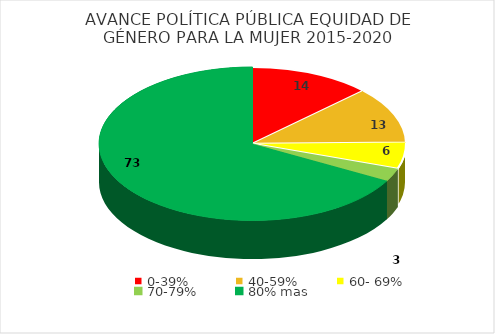
| Category | CANTIDAD |
|---|---|
| 0-39% | 14 |
| 40-59% | 13 |
| 60- 69% | 6 |
| 70-79% | 3 |
| 80% mas | 73 |